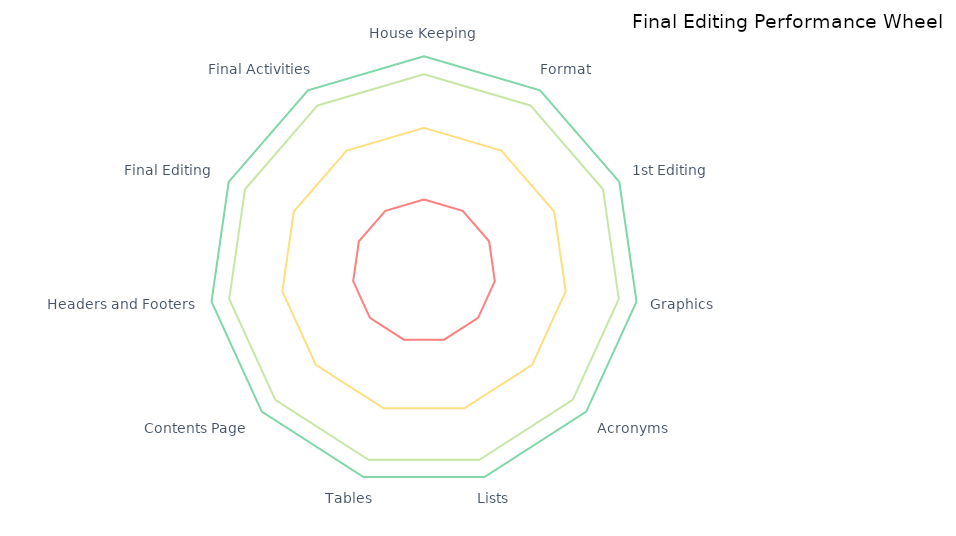
| Category | Series 1 | Series 2 | Series 3 | Series 4 | Series 0 |
|---|---|---|---|---|---|
| House Keeping | 1 | 2 | 2.75 | 3 | 0 |
| Format | 1 | 2 | 2.75 | 3 | 0 |
| 1st Editing | 1 | 2 | 2.75 | 3 | 0 |
| Graphics | 1 | 2 | 2.75 | 3 | 0 |
| Acronyms | 1 | 2 | 2.75 | 3 | 0 |
| Lists | 1 | 2 | 2.75 | 3 | 0 |
| Tables | 1 | 2 | 2.75 | 3 | 0 |
| Contents Page | 1 | 2 | 2.75 | 3 | 0 |
| Headers and Footers | 1 | 2 | 2.75 | 3 | 0 |
| Final Editing | 1 | 2 | 2.75 | 3 | 0 |
| Final Activities | 1 | 2 | 2.75 | 3 | 0 |